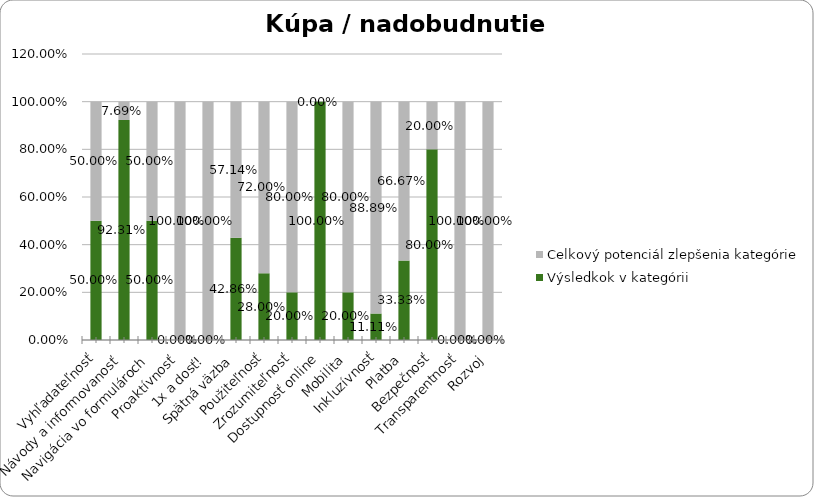
| Category | Výsledkok v kategórii | Celkový potenciál zlepšenia kategórie |
|---|---|---|
| Vyhľadateľnosť | 0.5 | 0.5 |
| Návody a informovanosť | 0.923 | 0.077 |
| Navigácia vo formulároch | 0.5 | 0.5 |
| Proaktívnosť | 0 | 1 |
| 1x a dosť! | 0 | 1 |
| Spätná väzba | 0.429 | 0.571 |
| Použiteľnosť | 0.28 | 0.72 |
| Zrozumiteľnosť | 0.2 | 0.8 |
| Dostupnosť online | 1 | 0 |
| Mobilita | 0.2 | 0.8 |
| Inkluzívnosť | 0.111 | 0.889 |
| Platba | 0.333 | 0.667 |
| Bezpečnosť | 0.8 | 0.2 |
| Transparentnosť | 0 | 1 |
| Rozvoj | 0 | 1 |